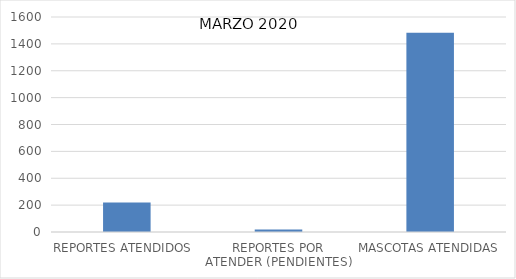
| Category | Series 0 |
|---|---|
| REPORTES ATENDIDOS  | 220 |
| REPORTES POR ATENDER (PENDIENTES) | 19 |
| MASCOTAS ATENDIDAS | 1483 |